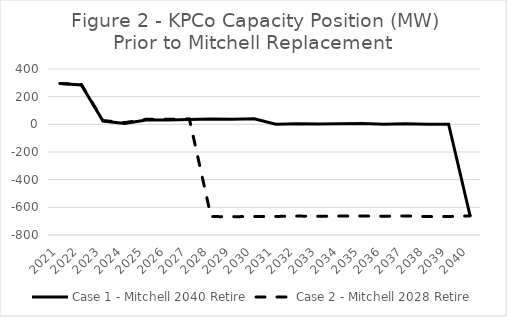
| Category | Case 1 - Mitchell 2040 Retire | Case 2 - Mitchell 2028 Retire |
|---|---|---|
| 2021.0 | 295.337 | 295.637 |
| 2022.0 | 285.113 | 287.213 |
| 2023.0 | 23.546 | 27.362 |
| 2024.0 | 6.078 | 12.191 |
| 2025.0 | 31.457 | 36.911 |
| 2026.0 | 31.666 | 36.436 |
| 2027.0 | 34.105 | 38.623 |
| 2028.0 | 38.054 | -666.896 |
| 2029.0 | 37.576 | -667.698 |
| 2030.0 | 39.663 | -666.214 |
| 2031.0 | 0.325 | -665.918 |
| 2032.0 | 3.751 | -663.248 |
| 2033.0 | 2.936 | -664.701 |
| 2034.0 | 4.999 | -663.126 |
| 2035.0 | 5.917 | -662.557 |
| 2036.0 | 0.065 | -664.479 |
| 2037.0 | 3.672 | -661.947 |
| 2038.0 | 0.011 | -667.104 |
| 2039.0 | 0.55 | -666.077 |
| 2040.0 | -664.245 | -661.739 |